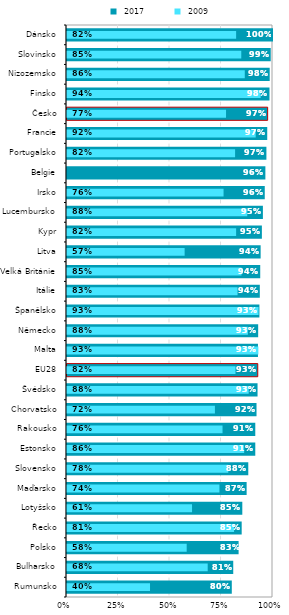
| Category |  2017 |
|---|---|
| Rumunsko | 0.8 |
| Bulharsko | 0.807 |
| Polsko | 0.833 |
| Řecko | 0.848 |
| Lotyšsko | 0.851 |
| Maďarsko | 0.872 |
| Slovensko | 0.88 |
| Estonsko | 0.914 |
| Rakousko | 0.914 |
| Chorvatsko | 0.92 |
| Švédsko | 0.925 |
| EU28 | 0.926 |
| Malta | 0.927 |
| Německo | 0.928 |
| Španělsko | 0.934 |
| Itálie | 0.936 |
| Velká Británie | 0.938 |
| Litva | 0.94 |
| Kypr | 0.946 |
| Lucembursko | 0.951 |
| Irsko | 0.96 |
| Belgie | 0.963 |
| Portugalsko | 0.968 |
| Francie | 0.972 |
| Česko | 0.974 |
| Finsko | 0.983 |
| Nizozemsko | 0.984 |
| Slovinsko | 0.989 |
| Dánsko | 1 |